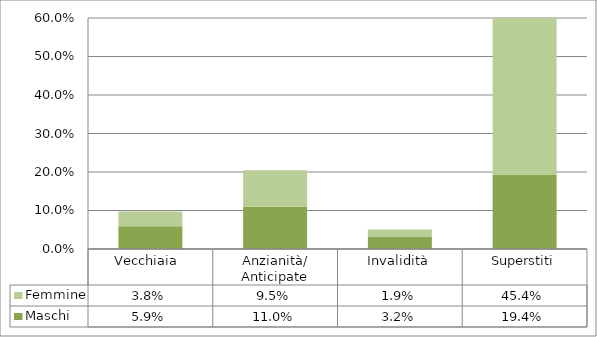
| Category | Maschi | Femmine |
|---|---|---|
| Vecchiaia  | 0.059 | 0.038 |
| Anzianità/ Anticipate | 0.11 | 0.095 |
| Invalidità | 0.032 | 0.019 |
| Superstiti | 0.194 | 0.454 |